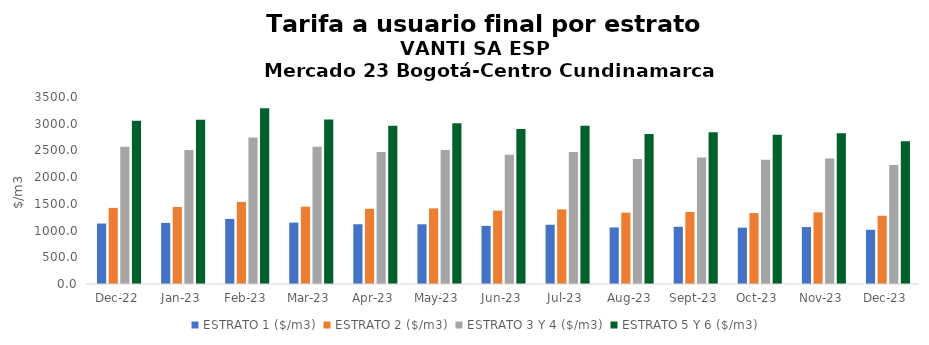
| Category | ESTRATO 1 ($/m3) | ESTRATO 2 ($/m3) | ESTRATO 3 Y 4 ($/m3) | ESTRATO 5 Y 6 ($/m3) |
|---|---|---|---|---|
| 2022-12-01 | 1131.49 | 1424.62 | 2567.53 | 3057.768 |
| 2023-01-01 | 1142.83 | 1440.88 | 2506.69 | 3074.928 |
| 2023-02-01 | 1217.5 | 1536.84 | 2741.78 | 3290.136 |
| 2023-03-01 | 1148.64 | 1447.09 | 2567.53 | 3081.036 |
| 2023-04-01 | 1118.47 | 1407.56 | 2468.54 | 2962.248 |
| 2023-05-01 | 1117.85 | 1415.65 | 2506.69 | 3008.028 |
| 2023-06-01 | 1087.36 | 1371.98 | 2417.38 | 2900.856 |
| 2023-07-01 | 1109.69 | 1396.46 | 2468.54 | 2962.248 |
| 2023-08-01 | 1058.46 | 1336.01 | 2339.09 | 2806.908 |
| 2023-09-01 | 1071.3 | 1349.34 | 2366.44 | 2839.728 |
| 2023-10-01 | 1054.11 | 1327.47 | 2326.42 | 2791.704 |
| 2023-11-01 | 1065.47 | 1341.49 | 2350.92 | 2821.104 |
| 2023-12-01 | 1014.3 | 1278 | 2225.9 | 2671.08 |